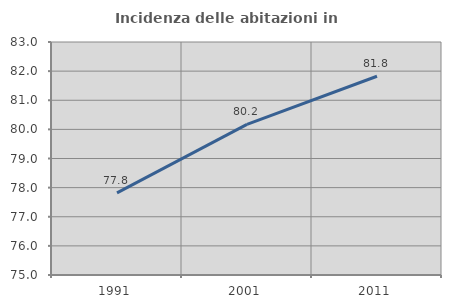
| Category | Incidenza delle abitazioni in proprietà  |
|---|---|
| 1991.0 | 77.818 |
| 2001.0 | 80.174 |
| 2011.0 | 81.825 |